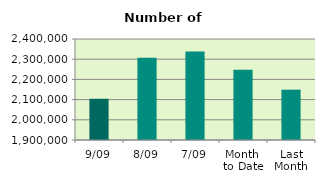
| Category | Series 0 |
|---|---|
| 9/09 | 2104012 |
| 8/09 | 2307446 |
| 7/09 | 2338608 |
| Month 
to Date | 2247266.857 |
| Last
Month | 2149140 |